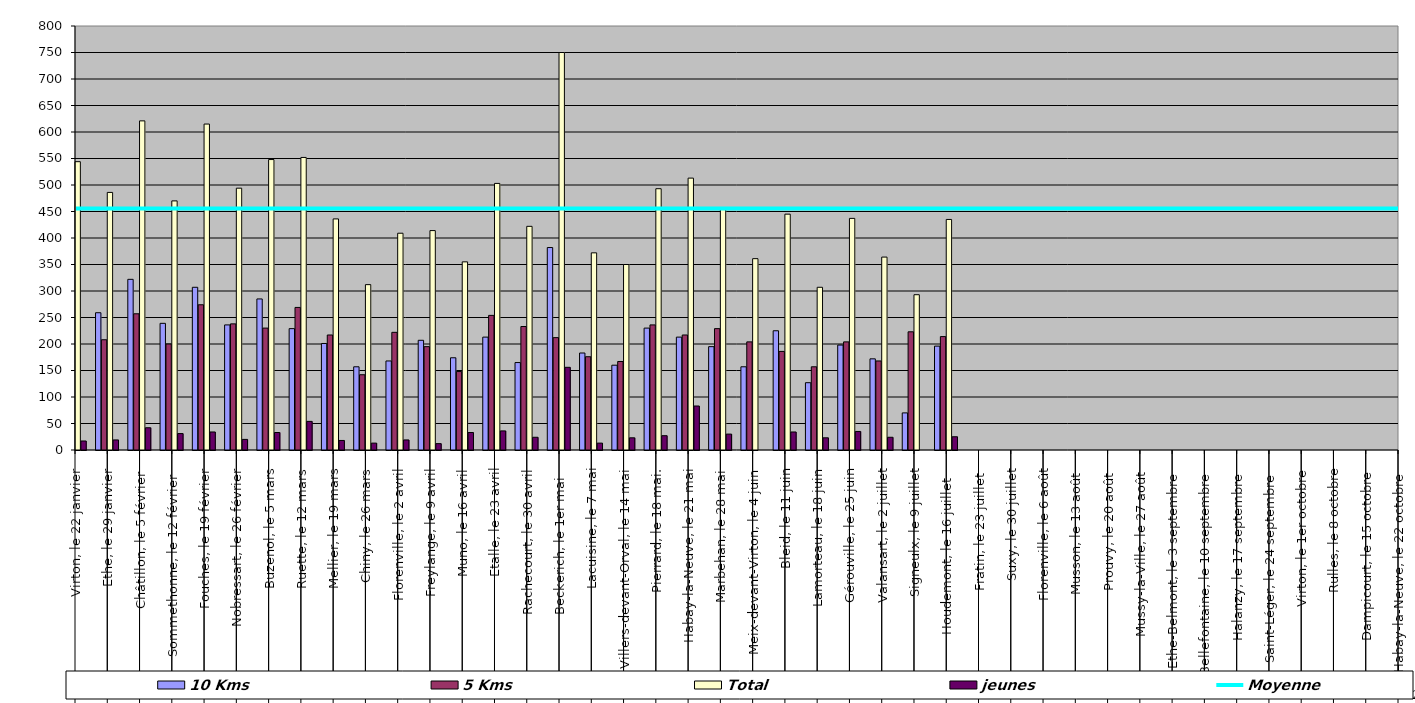
| Category | 10 Kms | 5 Kms | Total | jeunes |
|---|---|---|---|---|
| 0 | 296 | 231 | 544 | 17 |
| 1 | 259 | 208 | 486 | 19 |
| 2 | 322 | 257 | 621 | 42 |
| 3 | 239 | 200 | 470 | 31 |
| 4 | 307 | 274 | 615 | 34 |
| 5 | 236 | 238 | 494 | 20 |
| 6 | 285 | 230 | 548 | 33 |
| 7 | 229 | 269 | 552 | 54 |
| 8 | 201 | 217 | 436 | 18 |
| 9 | 157 | 142 | 312 | 13 |
| 10 | 168 | 222 | 409 | 19 |
| 11 | 207 | 195 | 414 | 12 |
| 12 | 174 | 148 | 355 | 33 |
| 13 | 213 | 254 | 503 | 36 |
| 14 | 165 | 233 | 422 | 24 |
| 15 | 382 | 212 | 750 | 156 |
| 16 | 183 | 176 | 372 | 13 |
| 17 | 160 | 167 | 350 | 23 |
| 18 | 230 | 236 | 493 | 27 |
| 19 | 213 | 217 | 513 | 83 |
| 20 | 195 | 229 | 454 | 30 |
| 21 | 157 | 204 | 361 | 0 |
| 22 | 225 | 186 | 445 | 34 |
| 23 | 127 | 157 | 307 | 23 |
| 24 | 198 | 204 | 437 | 35 |
| 25 | 172 | 168 | 364 | 24 |
| 26 | 70 | 223 | 293 | 0 |
| 27 | 196 | 214 | 435 | 25 |
| 28 | 0 | 0 | 0 | 0 |
| 29 | 0 | 0 | 0 | 0 |
| 30 | 0 | 0 | 0 | 0 |
| 31 | 0 | 0 | 0 | 0 |
| 32 | 0 | 0 | 0 | 0 |
| 33 | 0 | 0 | 0 | 0 |
| 34 | 0 | 0 | 0 | 0 |
| 35 | 0 | 0 | 0 | 0 |
| 36 | 0 | 0 | 0 | 0 |
| 37 | 0 | 0 | 0 | 0 |
| 38 | 0 | 0 | 0 | 0 |
| 39 | 0 | 0 | 0 | 0 |
| 40 | 0 | 0 | 0 | 0 |
| 41 | 0 | 0 | 0 | 0 |